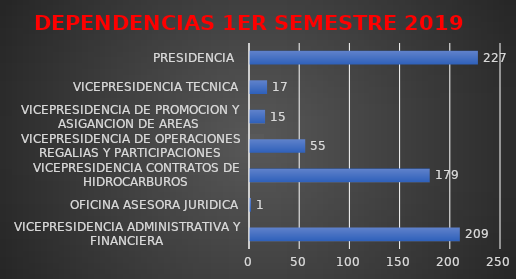
| Category | Series 0 |
|---|---|
| VICEPRESIDENCIA ADMINISTRATIVA Y FINANCIERA | 209 |
| OFICINA ASESORA JURIDICA | 1 |
| VICEPRESIDENCIA CONTRATOS DE HIDROCARBUROS | 179 |
| VICEPRESIDENCIA DE OPERACIONES REGALIAS Y PARTICIPACIONES | 55 |
| VICEPRESIDENCIA DE PROMOCION Y ASIGANCION DE AREAS  | 15 |
| VICEPRESIDENCIA TECNICA | 17 |
| PRESIDENCIA  | 227 |